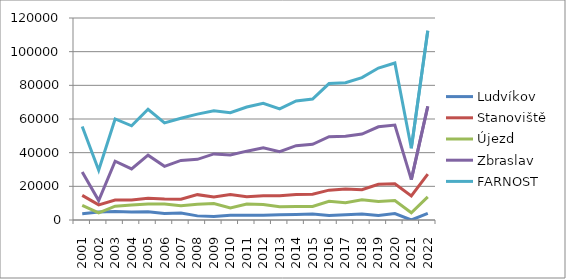
| Category | Ludvíkov | Stanoviště | Újezd | Zbraslav | FARNOST |
|---|---|---|---|---|---|
| 2001.0 | 3750 | 14606 | 8647 | 28569 | 55572 |
| 2002.0 | 4750 | 9014 | 4187 | 11580 | 29531 |
| 2003.0 | 5100 | 11820 | 8209 | 34909 | 60038 |
| 2004.0 | 4800 | 11892 | 8950 | 30319 | 55961 |
| 2005.0 | 4900 | 12857 | 9538 | 38497 | 65792 |
| 2006.0 | 3850 | 12448 | 9470 | 31899 | 57677 |
| 2007.0 | 4150 | 12330.5 | 8524 | 35405 | 60409.5 |
| 2008.0 | 2450 | 15065 | 9350 | 36040 | 62905 |
| 2009.0 | 2100 | 13722 | 9751 | 39265 | 64838 |
| 2010.0 | 2850 | 15170 | 7180 | 38565 | 63765 |
| 2011.0 | 2850 | 13876 | 9482 | 40892 | 67100 |
| 2012.0 | 2750 | 14450 | 9221 | 42931 | 69352 |
| 2013.0 | 3100 | 14444 | 7847 | 40567 | 65958 |
| 2014.0 | 3300 | 15215 | 8069 | 44133 | 70717 |
| 2015.0 | 3550 | 15280 | 8051 | 44977 | 71858 |
| 2016.0 | 2701 | 17738 | 11135 | 49477 | 81051 |
| 2017.0 | 3180 | 18433 | 10297 | 49688 | 81598 |
| 2018.0 | 3530 | 17995 | 12014 | 51064 | 84603 |
| 2019.0 | 2700 | 21185 | 11035 | 55365 | 90285 |
| 2020.0 | 3830 | 21463 | 11540 | 56429 | 93262 |
| 2021.0 | 0 | 14342 | 4303 | 24020 | 42665 |
| 2022.0 | 3970 | 27284 | 13691 | 67526 | 112471 |